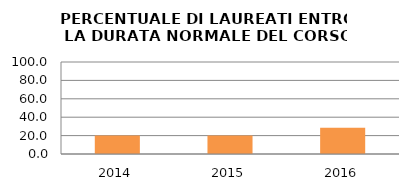
| Category | 2014 2015 2016 |
|---|---|
| 2014.0 | 20 |
| 2015.0 | 20 |
| 2016.0 | 28.571 |